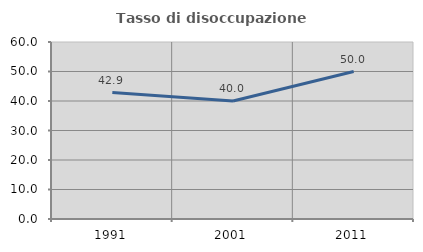
| Category | Tasso di disoccupazione giovanile  |
|---|---|
| 1991.0 | 42.857 |
| 2001.0 | 40 |
| 2011.0 | 50 |